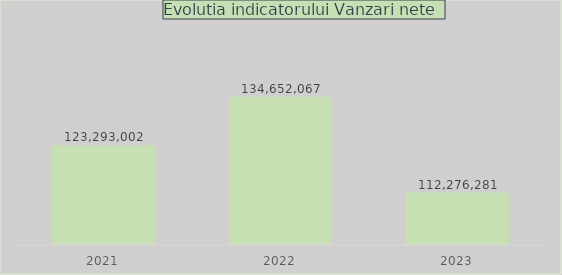
| Category | Series 0 |
|---|---|
| 2021.0 | 123293002 |
| 2022.0 | 134652067 |
| 2023.0 | 112276281 |